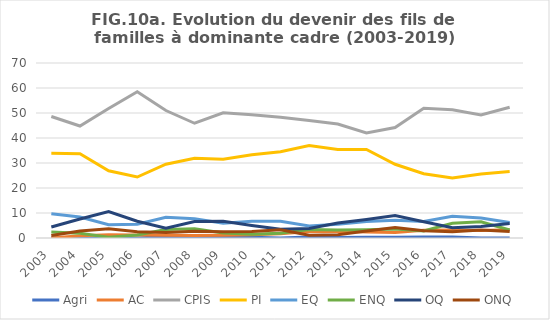
| Category | Agri | AC | CPIS | PI | EQ | ENQ | OQ | ONQ |
|---|---|---|---|---|---|---|---|---|
| 2003.0 | 0 | 0 | 48.6 | 33.9 | 9.7 | 2.4 | 4.4 | 1 |
| 2004.0 | 0 | 0.9 | 44.8 | 33.7 | 8.4 | 1.9 | 7.6 | 2.8 |
| 2005.0 | 0 | 1.3 | 51.8 | 26.9 | 5.3 | 0.3 | 10.6 | 3.7 |
| 2006.0 | 0 | 1.2 | 58.5 | 24.4 | 5.5 | 1.2 | 6.7 | 2.5 |
| 2007.0 | 0.6 | 1.1 | 51 | 29.5 | 8.3 | 3.4 | 3.9 | 2.2 |
| 2008.0 | 0.6 | 1 | 45.9 | 31.9 | 7.7 | 3.7 | 6.6 | 2.7 |
| 2009.0 | 0.3 | 1.1 | 50.1 | 31.5 | 5.9 | 2 | 6.7 | 2.5 |
| 2010.0 | 0.3 | 1.3 | 49.3 | 33.3 | 6.7 | 1.5 | 5 | 2.6 |
| 2011.0 | 0 | 1.7 | 48.3 | 34.5 | 6.7 | 1.9 | 3.5 | 3.3 |
| 2012.0 | 0.4 | 2.6 | 47 | 37 | 4.8 | 3.4 | 3.8 | 1.1 |
| 2013.0 | 0.2 | 2.7 | 45.6 | 35.4 | 5.5 | 3.2 | 6 | 1.3 |
| 2014.0 | 0.3 | 2.4 | 42 | 35.4 | 6.6 | 3.3 | 7.4 | 2.8 |
| 2015.0 | 0.3 | 2.2 | 44.2 | 29.5 | 7.1 | 3.6 | 9 | 4.2 |
| 2016.0 | 0.4 | 3.1 | 51.9 | 25.7 | 6.6 | 2.8 | 6.5 | 2.9 |
| 2017.0 | 0.4 | 3.2 | 51.3 | 24 | 8.7 | 5.9 | 4.1 | 2.5 |
| 2018.0 | 0 | 3 | 49.2 | 25.6 | 8 | 6.5 | 4.6 | 3.2 |
| 2019.0 | 0 | 3.3 | 52.3 | 26.6 | 6.2 | 3.2 | 5.8 | 2.6 |